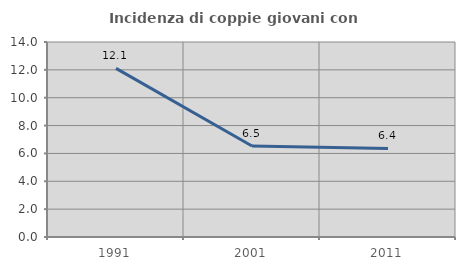
| Category | Incidenza di coppie giovani con figli |
|---|---|
| 1991.0 | 12.105 |
| 2001.0 | 6.533 |
| 2011.0 | 6.358 |